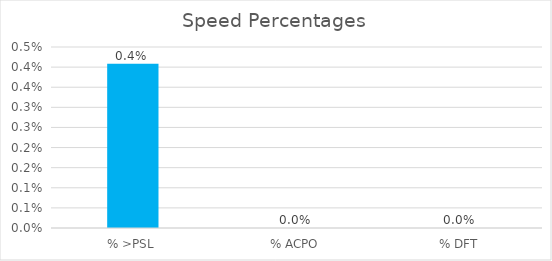
| Category | Series 0 |
|---|---|
| % >PSL | 0.004 |
| % ACPO | 0 |
| % DFT | 0 |